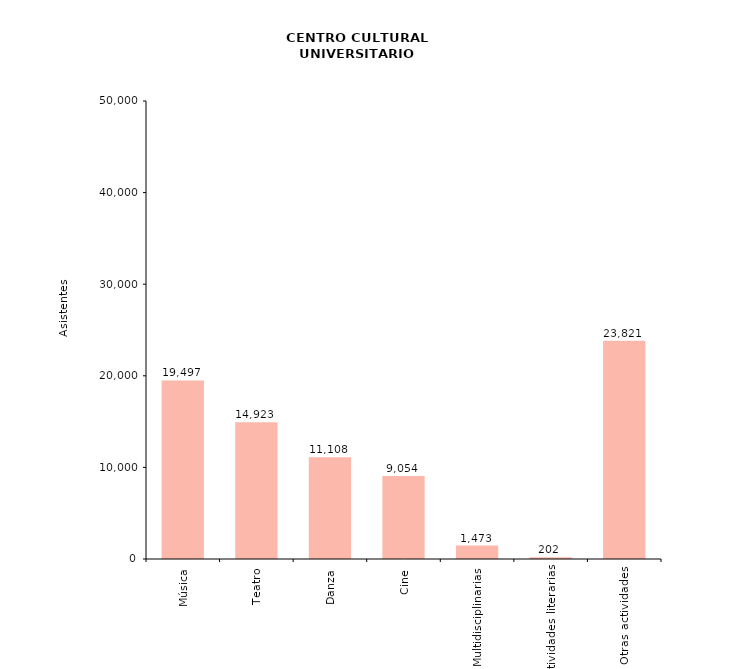
| Category | Series 0 |
|---|---|
| Música | 19497 |
| Teatro | 14923 |
| Danza | 11108 |
| Cine | 9054 |
| Multidisciplinarias | 1473 |
| Actividades literarias | 202 |
| Otras actividades | 23821 |